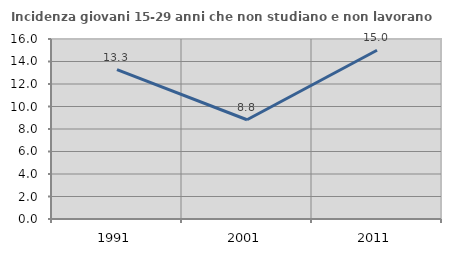
| Category | Incidenza giovani 15-29 anni che non studiano e non lavorano  |
|---|---|
| 1991.0 | 13.274 |
| 2001.0 | 8.824 |
| 2011.0 | 15 |